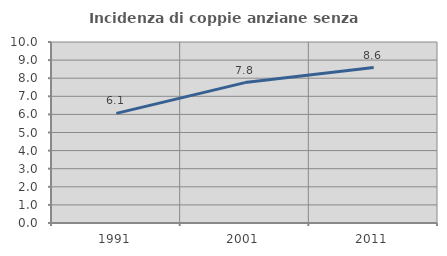
| Category | Incidenza di coppie anziane senza figli  |
|---|---|
| 1991.0 | 6.058 |
| 2001.0 | 7.757 |
| 2011.0 | 8.589 |